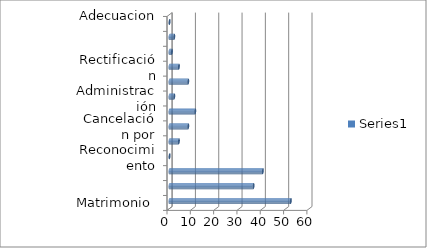
| Category | Series 0 |
|---|---|
| Matrimonio | 52 |
| Divorcio | 36 |
| Defunción | 40 |
| nulidad | 0 |
| Cancelación por Reconocimiento | 4 |
| Cancelación por Divorcio | 8 |
| Viudez | 11 |
| Rectificación Judicial/ Notarial | 2 |
| Rectificación Administración | 8 |
| Identidad Personal | 4 |
| Perdida de Autoridad Parental | 1 |
| Tutoria | 2 |
| Adecuacion | 0 |